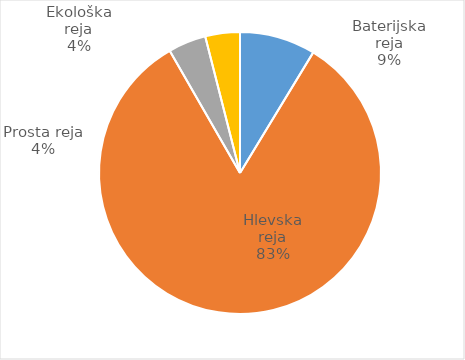
| Category | Število kosov jajc |
|---|---|
| Baterijska reja | 280179 |
| Hlevska reja | 2676846 |
| Prosta reja | 139776 |
| Ekološka reja | 128020 |